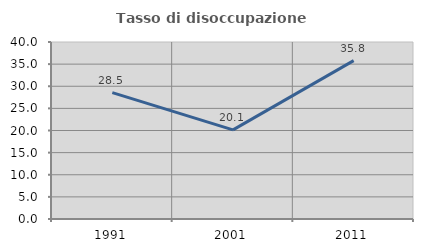
| Category | Tasso di disoccupazione giovanile  |
|---|---|
| 1991.0 | 28.55 |
| 2001.0 | 20.134 |
| 2011.0 | 35.783 |